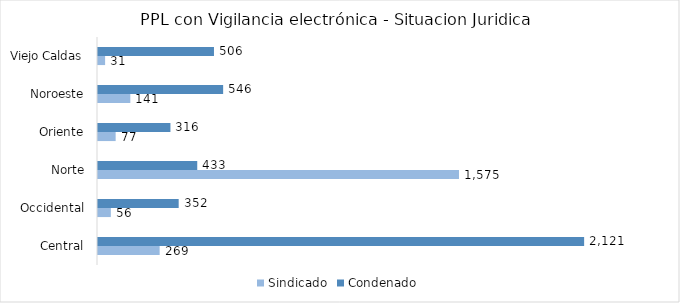
| Category | Sindicado | Condenado |
|---|---|---|
| Central | 269 | 2121 |
| Occidental | 56 | 352 |
| Norte | 1575 | 433 |
| Oriente | 77 | 316 |
| Noroeste | 141 | 546 |
| Viejo Caldas | 31 | 506 |